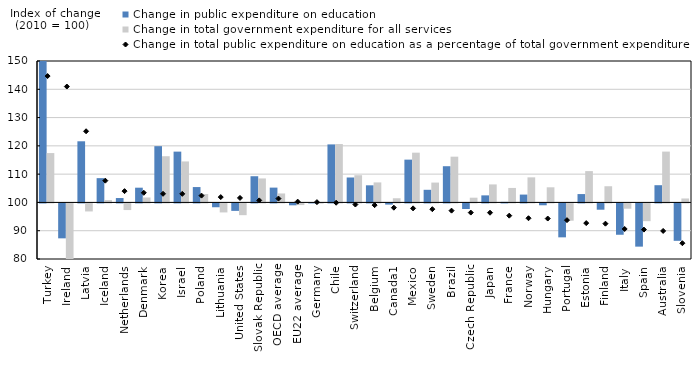
| Category | Change in public expenditure on education | Change in total government expenditure for all services |
|---|---|---|
| Turkey | 169.927 | 117.454 |
| Ireland | 87.656 | 62.181 |
| Latvia | 121.615 | 97.168 |
| Iceland | 108.582 | 100.823 |
| Netherlands | 101.552 | 97.655 |
| Denmark | 105.212 | 101.747 |
| Korea | 119.893 | 116.337 |
| Israel | 117.963 | 114.491 |
| Poland | 105.435 | 102.958 |
| Lithuania | 98.647 | 96.821 |
| United States | 97.366 | 95.848 |
| Slovak Republic | 109.263 | 108.479 |
| OECD average | 105.238 | 103.171 |
| EU22 average | 99.334 | 99.42 |
| Germany | 100.021 | 99.922 |
| Chile | 120.515 | 120.643 |
| Switzerland | 108.815 | 109.628 |
| Belgium | 106.05 | 107.075 |
| Canada1 | 99.592 | 101.476 |
| Mexico | 115.126 | 117.59 |
| Sweden | 104.464 | 107.019 |
| Brazil | 112.804 | 116.177 |
| Czech Republic | 98.024 | 101.673 |
| Japan | 102.496 | 106.366 |
| France | 100.2 | 105.118 |
| Norway | 102.775 | 108.862 |
| Hungary | 99.347 | 105.348 |
| Portugal | 88.01 | 93.892 |
| Estonia | 102.955 | 111.075 |
| Finland | 97.776 | 105.72 |
| Italy | 88.924 | 98.133 |
| Spain | 84.724 | 93.73 |
| Australia | 106.09 | 117.975 |
| Slovenia | 86.777 | 101.396 |